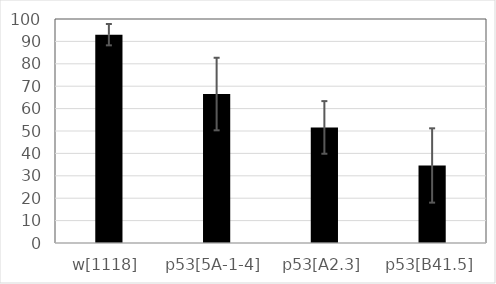
| Category | Series 0 |
|---|---|
| w[1118] | 93 |
| p53[5A-1-4] | 66.5 |
| p53[A2.3] | 51.594 |
| p53[B41.5] | 34.606 |